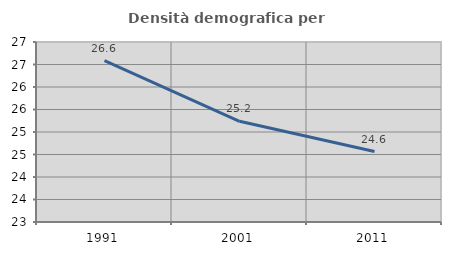
| Category | Densità demografica |
|---|---|
| 1991.0 | 26.584 |
| 2001.0 | 25.238 |
| 2011.0 | 24.565 |